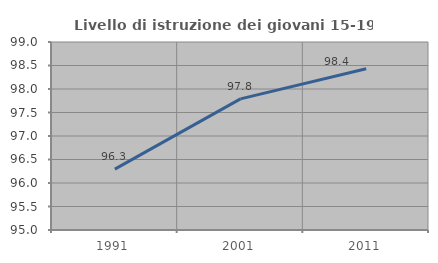
| Category | Livello di istruzione dei giovani 15-19 anni |
|---|---|
| 1991.0 | 96.296 |
| 2001.0 | 97.79 |
| 2011.0 | 98.429 |